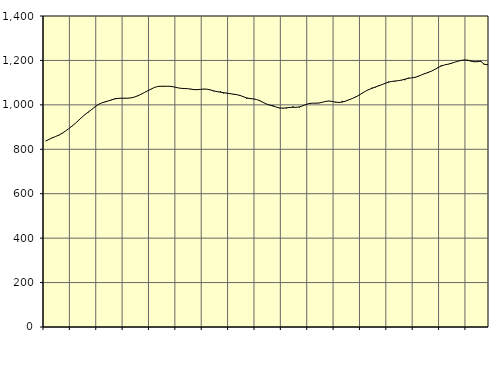
| Category | Piggar | Series 1 |
|---|---|---|
| nan | 837.2 | 837.03 |
| 87.0 | 844.1 | 844.34 |
| 87.0 | 853.3 | 851.46 |
| 87.0 | 857.9 | 857.43 |
| nan | 861.9 | 863.77 |
| 88.0 | 873.3 | 872.06 |
| 88.0 | 882.4 | 882.04 |
| 88.0 | 892.5 | 892.75 |
| nan | 903.9 | 904.34 |
| 89.0 | 916.7 | 916.91 |
| 89.0 | 929.1 | 930.48 |
| 89.0 | 943.9 | 944.34 |
| nan | 958.7 | 957.12 |
| 90.0 | 966.6 | 968.43 |
| 90.0 | 978.6 | 979.47 |
| 90.0 | 990.4 | 991.28 |
| nan | 1003.1 | 1001.68 |
| 91.0 | 1008.8 | 1008.76 |
| 91.0 | 1012.4 | 1013.27 |
| 91.0 | 1018.2 | 1017.52 |
| nan | 1020.9 | 1022.63 |
| 92.0 | 1030 | 1026.81 |
| 92.0 | 1027.6 | 1029.25 |
| 92.0 | 1031 | 1030.01 |
| nan | 1031.4 | 1029.8 |
| 93.0 | 1029.3 | 1030 |
| 93.0 | 1033.1 | 1031.62 |
| 93.0 | 1035.6 | 1035.51 |
| nan | 1039.4 | 1041.19 |
| 94.0 | 1047.6 | 1048.31 |
| 94.0 | 1057.3 | 1056.01 |
| 94.0 | 1062.6 | 1063.61 |
| nan | 1070.5 | 1071.22 |
| 95.0 | 1079.1 | 1078.28 |
| 95.0 | 1083.2 | 1082.67 |
| 95.0 | 1083.2 | 1083.63 |
| nan | 1085.1 | 1083.55 |
| 96.0 | 1083.4 | 1083.77 |
| 96.0 | 1084.2 | 1083.2 |
| 96.0 | 1080.7 | 1080.52 |
| nan | 1077.1 | 1076.98 |
| 97.0 | 1075.1 | 1074.45 |
| 97.0 | 1074.1 | 1073.63 |
| 97.0 | 1072.4 | 1072.83 |
| nan | 1072.2 | 1070.81 |
| 98.0 | 1066.6 | 1068.82 |
| 98.0 | 1070.2 | 1068.4 |
| 98.0 | 1070.2 | 1069.72 |
| nan | 1072 | 1071.07 |
| 99.0 | 1070 | 1070.34 |
| 99.0 | 1068.2 | 1067 |
| 99.0 | 1060.9 | 1062.84 |
| nan | 1058.3 | 1059.69 |
| 0.0 | 1061.8 | 1057.15 |
| 0.0 | 1051.2 | 1054.71 |
| 0.0 | 1054.1 | 1052.46 |
| nan | 1049.9 | 1050.35 |
| 1.0 | 1045.6 | 1048.03 |
| 1.0 | 1045.3 | 1045.64 |
| 1.0 | 1044.4 | 1042.15 |
| nan | 1038.1 | 1036.54 |
| 2.0 | 1027.2 | 1031.09 |
| 2.0 | 1030.1 | 1028.3 |
| 2.0 | 1025.9 | 1026.94 |
| nan | 1024.1 | 1023.96 |
| 3.0 | 1020.2 | 1018.31 |
| 3.0 | 1011.2 | 1010.81 |
| 3.0 | 1003.2 | 1003.78 |
| nan | 997.9 | 998.77 |
| 4.0 | 997.8 | 994.65 |
| 4.0 | 989.7 | 989.89 |
| 4.0 | 984.7 | 986.09 |
| nan | 984 | 985.1 |
| 5.0 | 983.9 | 986.59 |
| 5.0 | 986.8 | 988.45 |
| 5.0 | 993.2 | 988.95 |
| nan | 988 | 989.01 |
| 6.0 | 987.9 | 990.74 |
| 6.0 | 996.7 | 995.61 |
| 6.0 | 999.8 | 1001.92 |
| nan | 1008.3 | 1006.23 |
| 7.0 | 1007.3 | 1007.67 |
| 7.0 | 1006.7 | 1007.57 |
| 7.0 | 1007.7 | 1008.62 |
| nan | 1012.4 | 1011.95 |
| 8.0 | 1016.4 | 1015.82 |
| 8.0 | 1017.9 | 1017.26 |
| 8.0 | 1015 | 1015.27 |
| nan | 1010.2 | 1012.26 |
| 9.0 | 1011.4 | 1010.84 |
| 9.0 | 1017.8 | 1012.62 |
| 9.0 | 1016 | 1016.93 |
| nan | 1023.2 | 1022.62 |
| 10.0 | 1028.8 | 1028.62 |
| 10.0 | 1036.2 | 1035.05 |
| 10.0 | 1041.8 | 1043.05 |
| nan | 1053.3 | 1052.3 |
| 11.0 | 1060.8 | 1061.14 |
| 11.0 | 1066.8 | 1068.51 |
| 11.0 | 1077.2 | 1074.57 |
| nan | 1078 | 1080.22 |
| 12.0 | 1087.9 | 1085.42 |
| 12.0 | 1091.1 | 1090.8 |
| 12.0 | 1095.9 | 1096.85 |
| nan | 1104.8 | 1102.01 |
| 13.0 | 1105.4 | 1105.42 |
| 13.0 | 1105 | 1107.32 |
| 13.0 | 1108.5 | 1109.01 |
| nan | 1110.5 | 1111.63 |
| 14.0 | 1111 | 1115.51 |
| 14.0 | 1122 | 1119.23 |
| 14.0 | 1121.5 | 1121.42 |
| nan | 1122.1 | 1123.65 |
| 15.0 | 1130.4 | 1128.28 |
| 15.0 | 1135.2 | 1134.9 |
| 15.0 | 1142.5 | 1140.57 |
| nan | 1143.1 | 1145.73 |
| 16.0 | 1151.2 | 1151.54 |
| 16.0 | 1161 | 1158.99 |
| 16.0 | 1166.1 | 1167.41 |
| nan | 1177.9 | 1174.87 |
| 17.0 | 1179.8 | 1179.77 |
| 17.0 | 1181.6 | 1182.79 |
| 17.0 | 1184.4 | 1186.66 |
| nan | 1191.8 | 1191.46 |
| 18.0 | 1195.7 | 1196.12 |
| 18.0 | 1197.8 | 1199.8 |
| 18.0 | 1203.1 | 1201.77 |
| nan | 1203 | 1200.7 |
| 19.0 | 1199.4 | 1197 |
| 19.0 | 1192.4 | 1194.24 |
| 19.0 | 1197.1 | 1194.59 |
| nan | 1193.9 | 1196.48 |
| 20.0 | 1181.4 | 1183.34 |
| 20.0 | 1183 | 1180.36 |